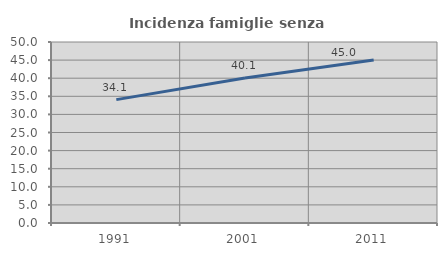
| Category | Incidenza famiglie senza nuclei |
|---|---|
| 1991.0 | 34.084 |
| 2001.0 | 40.056 |
| 2011.0 | 45.04 |